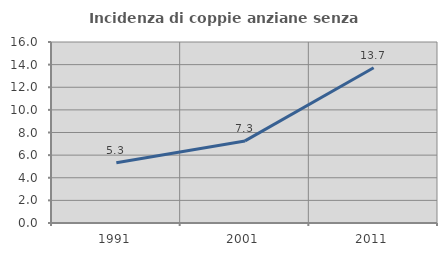
| Category | Incidenza di coppie anziane senza figli  |
|---|---|
| 1991.0 | 5.329 |
| 2001.0 | 7.256 |
| 2011.0 | 13.728 |